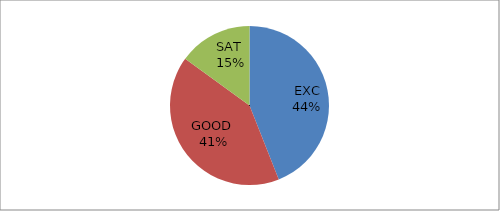
| Category | Series 0 |
|---|---|
| EXC | 44 |
| GOOD  | 41 |
| SAT  | 15 |